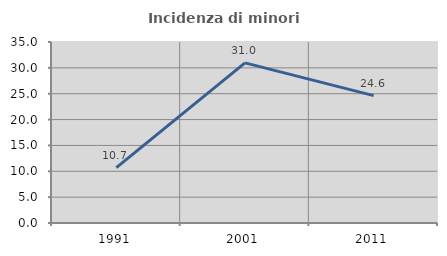
| Category | Incidenza di minori stranieri |
|---|---|
| 1991.0 | 10.714 |
| 2001.0 | 30.962 |
| 2011.0 | 24.635 |